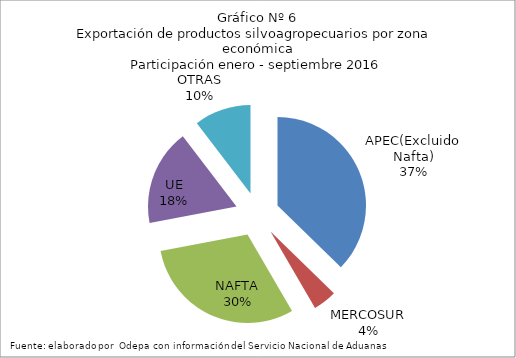
| Category | Series 0 |
|---|---|
| APEC(Excluido Nafta) | 4293987.173 |
| MERCOSUR | 496191.761 |
| NAFTA | 3500603.556 |
| UE | 2028685.85 |
| OTRAS | 1194090.661 |